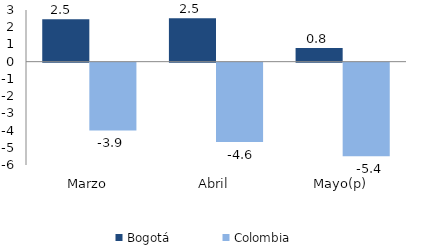
| Category | Bogotá | Colombia |
|---|---|---|
| Marzo | 2.458 | -3.937 |
| Abril | 2.523 | -4.6 |
| Mayo(p) | 0.8 | -5.434 |